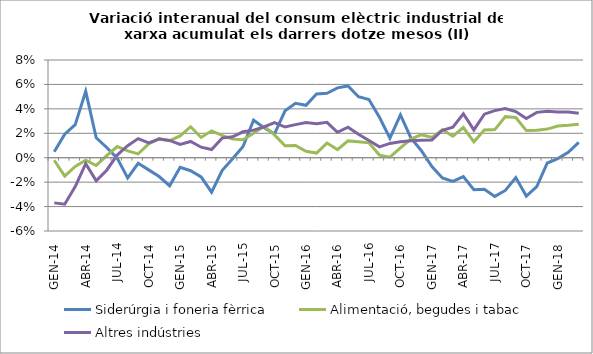
| Category | Siderúrgia i foneria fèrrica | Alimentació, begudes i tabac | Altres indústries |
|---|---|---|---|
| GEN-14 | 0.005 | -0.002 | -0.037 |
| FEB-14 | 0.019 | -0.015 | -0.038 |
| MAR-14 | 0.027 | -0.007 | -0.024 |
| ABR-14 | 0.054 | -0.002 | -0.005 |
| MAI-14 | 0.016 | -0.006 | -0.019 |
| JUN-14 | 0.008 | 0.002 | -0.01 |
| JUL-14 | 0 | 0.009 | 0.002 |
| AGO-14 | -0.017 | 0.006 | 0.01 |
| SET-14 | -0.005 | 0.003 | 0.016 |
| OCT-14 | -0.01 | 0.011 | 0.012 |
| NOV-14 | -0.015 | 0.016 | 0.015 |
| DES-14 | -0.023 | 0.014 | 0.014 |
| GEN-15 | -0.008 | 0.018 | 0.011 |
| FEB-15 | -0.011 | 0.025 | 0.013 |
| MAR-15 | -0.016 | 0.017 | 0.009 |
| ABR-15 | -0.028 | 0.022 | 0.007 |
| MAI-15 | -0.011 | 0.018 | 0.016 |
| JUN-15 | -0.001 | 0.015 | 0.017 |
| JUL-15 | 0.009 | 0.015 | 0.021 |
| AGO-15 | 0.031 | 0.02 | 0.023 |
| SET-15 | 0.025 | 0.026 | 0.025 |
| OCT-15 | 0.019 | 0.019 | 0.029 |
| NOV-15 | 0.038 | 0.01 | 0.025 |
| DES-15 | 0.044 | 0.01 | 0.027 |
| GEN-16 | 0.043 | 0.005 | 0.029 |
| FEB-16 | 0.052 | 0.004 | 0.028 |
| MAR-16 | 0.053 | 0.012 | 0.029 |
| ABR-16 | 0.057 | 0.007 | 0.021 |
| MAI-16 | 0.059 | 0.014 | 0.025 |
| JUN-16 | 0.05 | 0.013 | 0.019 |
| JUL-16 | 0.048 | 0.012 | 0.014 |
| AGO-16 | 0.033 | 0.002 | 0.009 |
| SET-16 | 0.016 | 0 | 0.012 |
| OCT-16 | 0.035 | 0.008 | 0.013 |
| NOV-16 | 0.016 | 0.015 | 0.014 |
| DES-16 | 0.006 | 0.019 | 0.014 |
| GEN-17 | -0.007 | 0.017 | 0.014 |
| FEB-17 | -0.017 | 0.023 | 0.022 |
| MAR-17 | -0.019 | 0.018 | 0.025 |
| ABR-17 | -0.016 | 0.025 | 0.036 |
| MAI-17 | -0.026 | 0.013 | 0.023 |
| JUN-17 | -0.026 | 0.023 | 0.036 |
| JUL-17 | -0.032 | 0.023 | 0.039 |
| AGO-17 | -0.027 | 0.034 | 0.04 |
| SET-17 | -0.016 | 0.033 | 0.038 |
| OCT-17 | -0.031 | 0.022 | 0.032 |
| NOV-17 | -0.024 | 0.023 | 0.037 |
| DES-17 | -0.004 | 0.023 | 0.038 |
| GEN-18 | -0.001 | 0.026 | 0.037 |
| FEB-18 | 0.004 | 0.027 | 0.037 |
| MAR-18 | 0.013 | 0.027 | 0.036 |